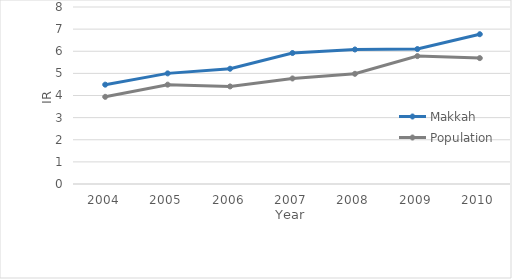
| Category | Makkah | Population |
|---|---|---|
| 2004.0 | 4.49 | 3.94 |
| 2005.0 | 5 | 4.49 |
| 2006.0 | 5.21 | 4.41 |
| 2007.0 | 5.92 | 4.77 |
| 2008.0 | 6.08 | 4.98 |
| 2009.0 | 6.1 | 5.78 |
| 2010.0 | 6.77 | 5.69 |